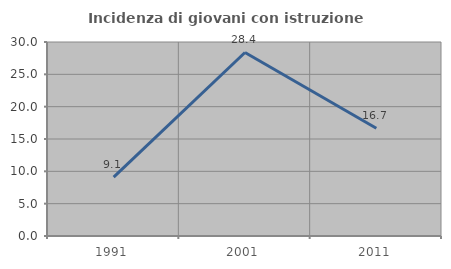
| Category | Incidenza di giovani con istruzione universitaria |
|---|---|
| 1991.0 | 9.091 |
| 2001.0 | 28.378 |
| 2011.0 | 16.667 |